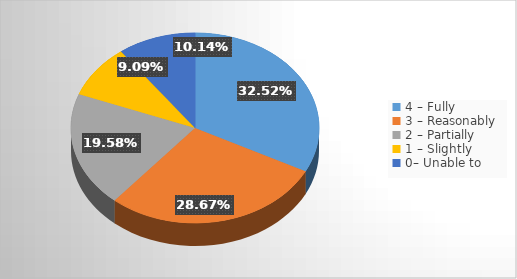
| Category | Series 0 |
|---|---|
| 4 – Fully   | 0.325 |
| 3 – Reasonably    | 0.287 |
| 2 – Partially    | 0.196 |
| 1 – Slightly    | 0.091 |
| 0– Unable to | 0.101 |